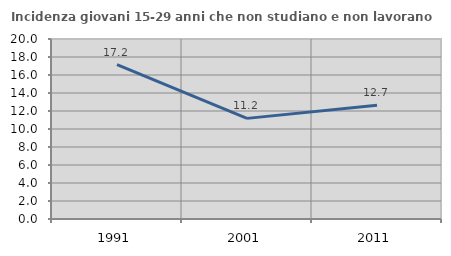
| Category | Incidenza giovani 15-29 anni che non studiano e non lavorano  |
|---|---|
| 1991.0 | 17.163 |
| 2001.0 | 11.18 |
| 2011.0 | 12.651 |